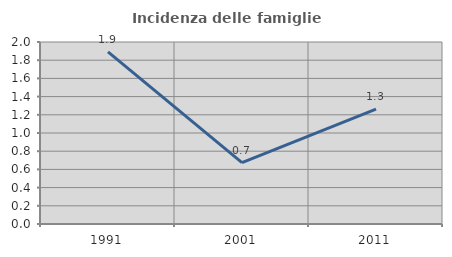
| Category | Incidenza delle famiglie numerose |
|---|---|
| 1991.0 | 1.892 |
| 2001.0 | 0.674 |
| 2011.0 | 1.262 |